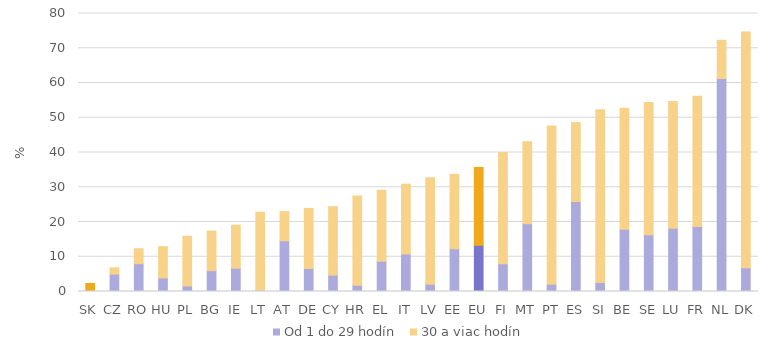
| Category | Od 1 do 29 hodín | 30 a viac hodín |
|---|---|---|
| SK | 0 | 2.3 |
| CZ | 5 | 1.8 |
| RO | 8 | 4.3 |
| HU | 3.9 | 9 |
| PL | 1.6 | 14.3 |
| BG | 6 | 11.4 |
| IE | 6.7 | 12.4 |
| LT | 0.4 | 22.4 |
| AT | 14.6 | 8.4 |
| DE | 6.6 | 17.3 |
| CY | 4.7 | 19.7 |
| HR | 1.8 | 25.7 |
| EL | 8.7 | 20.4 |
| IT | 10.8 | 20.1 |
| LV | 2.1 | 30.6 |
| EE | 12.3 | 21.4 |
| EU | 13.3 | 22.4 |
| FI | 8 | 32 |
| MT | 19.5 | 23.6 |
| PT | 2.1 | 45.5 |
| ES | 25.9 | 22.7 |
| SI | 2.6 | 49.7 |
| BE | 17.9 | 34.8 |
| SE | 16.3 | 38.1 |
| LU | 18.2 | 36.5 |
| FR | 18.7 | 37.5 |
| NL | 61.3 | 11 |
| DK | 6.8 | 67.9 |